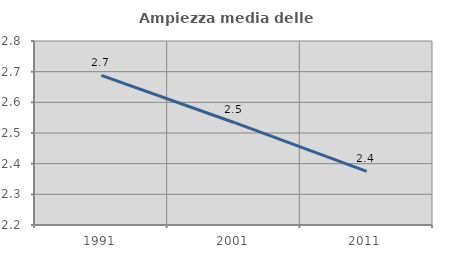
| Category | Ampiezza media delle famiglie |
|---|---|
| 1991.0 | 2.688 |
| 2001.0 | 2.534 |
| 2011.0 | 2.375 |